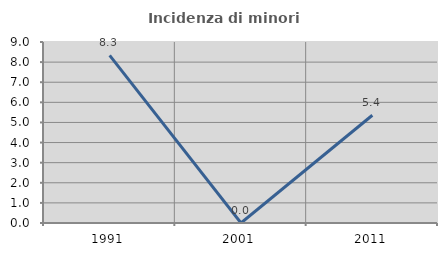
| Category | Incidenza di minori stranieri |
|---|---|
| 1991.0 | 8.333 |
| 2001.0 | 0 |
| 2011.0 | 5.357 |